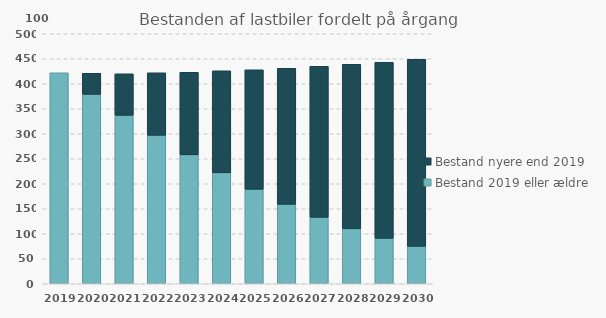
| Category | Bestand 2019 eller ældre | Bestand nyere end 2019 |
|---|---|---|
| 2019 | 422 | 0 |
| 2020 | 379 | 42 |
| 2021 | 337 | 83 |
| 2022 | 297 | 125 |
| 2023 | 258 | 165 |
| 2024 | 222 | 204 |
| 2025 | 189 | 239 |
| 2026 | 159 | 272 |
| 2027 | 133 | 302 |
| 2028 | 110 | 329 |
| 2029 | 91 | 352 |
| 2030 | 75 | 374 |